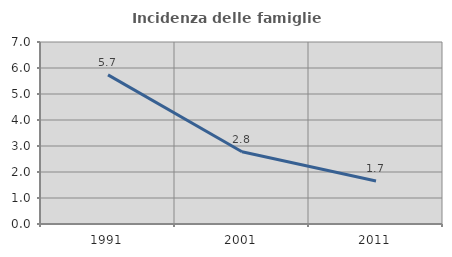
| Category | Incidenza delle famiglie numerose |
|---|---|
| 1991.0 | 5.736 |
| 2001.0 | 2.776 |
| 2011.0 | 1.654 |